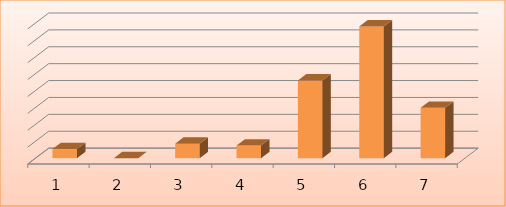
| Category | Series 0 |
|---|---|
| 0 | 1078307 |
| 1 | 0 |
| 2 | 1716162 |
| 3 | 1495200 |
| 4 | 9207300 |
| 5 | 15603500 |
| 6 | 5968488 |